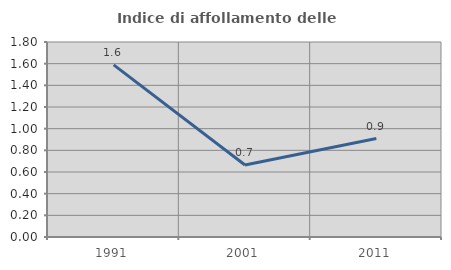
| Category | Indice di affollamento delle abitazioni  |
|---|---|
| 1991.0 | 1.589 |
| 2001.0 | 0.665 |
| 2011.0 | 0.909 |